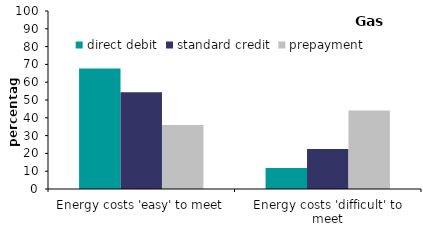
| Category | direct debit | standard credit | prepayment |
|---|---|---|---|
| Energy costs 'easy' to meet | 67.682 | 54.335 | 35.963 |
| Energy costs 'difficult' to meet | 11.801 | 22.498 | 44.053 |